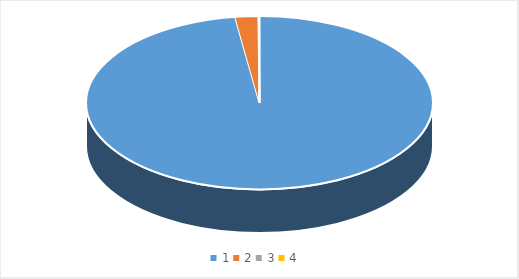
| Category | Series 0 |
|---|---|
| 0 | 104700162.57 |
| 1 | 2297461.7 |
| 2 | 55250 |
| 3 | 49200.69 |